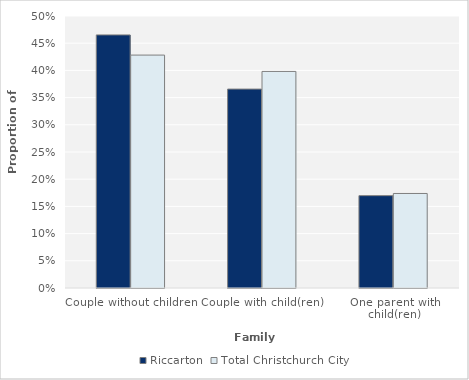
| Category | Riccarton | Total Christchurch City |
|---|---|---|
| Couple without children | 0.465 | 0.428 |
| Couple with child(ren) | 0.366 | 0.398 |
| One parent with child(ren) | 0.17 | 0.174 |